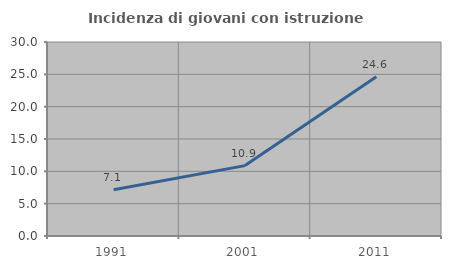
| Category | Incidenza di giovani con istruzione universitaria |
|---|---|
| 1991.0 | 7.143 |
| 2001.0 | 10.884 |
| 2011.0 | 24.615 |